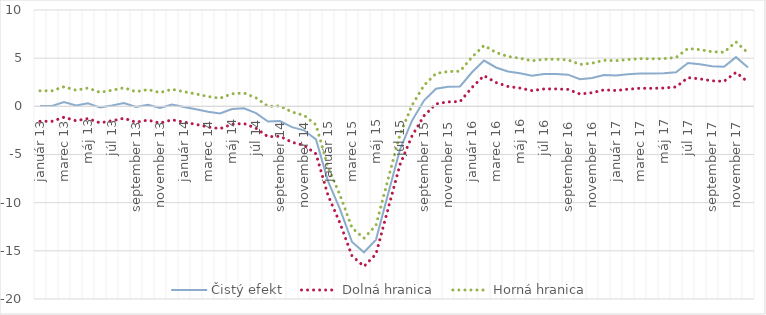
| Category | Čistý efekt | Dolná hranica | Horná hranica |
|---|---|---|---|
| 2013-01-01 | 0.032 | -1.552 | 1.616 |
| 2013-02-01 | 0.032 | -1.552 | 1.616 |
| 2013-03-01 | 0.451 | -1.133 | 2.035 |
| 2013-04-01 | 0.087 | -1.497 | 1.671 |
| 2013-05-01 | 0.317 | -1.267 | 1.901 |
| 2013-06-01 | -0.131 | -1.715 | 1.453 |
| 2013-07-01 | 0.084 | -1.5 | 1.668 |
| 2013-08-01 | 0.345 | -1.239 | 1.929 |
| 2013-09-01 | -0.065 | -1.649 | 1.519 |
| 2013-10-01 | 0.155 | -1.429 | 1.739 |
| 2013-11-01 | -0.161 | -1.745 | 1.423 |
| 2013-12-01 | 0.187 | -1.396 | 1.771 |
| 2014-01-01 | -0.064 | -1.644 | 1.517 |
| 2014-02-01 | -0.295 | -1.875 | 1.285 |
| 2014-03-01 | -0.56 | -2.141 | 1.021 |
| 2014-04-01 | -0.742 | -2.323 | 0.839 |
| 2014-05-01 | -0.276 | -1.858 | 1.305 |
| 2014-06-01 | -0.203 | -1.784 | 1.378 |
| 2014-07-01 | -0.701 | -2.28 | 0.878 |
| 2014-08-01 | -1.578 | -3.153 | -0.003 |
| 2014-09-01 | -1.53 | -3.105 | 0.045 |
| 2014-10-01 | -2.161 | -3.73 | -0.592 |
| 2014-11-01 | -2.488 | -4.046 | -0.931 |
| 2014-12-01 | -3.429 | -4.935 | -1.923 |
| 2015-01-01 | -7.762 | -9.231 | -6.293 |
| 2015-02-01 | -10.669 | -12.131 | -9.207 |
| 2015-03-01 | -14.072 | -15.527 | -12.617 |
| 2015-04-01 | -15.15 | -16.613 | -13.688 |
| 2015-05-01 | -13.837 | -15.33 | -12.344 |
| 2015-06-01 | -9.123 | -10.666 | -7.581 |
| 2015-07-01 | -4.477 | -6.049 | -2.906 |
| 2015-08-01 | -1.489 | -3.072 | 0.094 |
| 2015-09-01 | 0.6 | -0.982 | 2.182 |
| 2015-10-01 | 1.83 | 0.252 | 3.408 |
| 2015-11-01 | 2.04 | 0.466 | 3.614 |
| 2015-12-01 | 2.065 | 0.49 | 3.64 |
| 2016-01-01 | 3.534 | 1.959 | 5.109 |
| 2016-02-01 | 4.75 | 3.186 | 6.314 |
| 2016-03-01 | 4.032 | 2.473 | 5.592 |
| 2016-04-01 | 3.618 | 2.064 | 5.172 |
| 2016-05-01 | 3.443 | 1.895 | 4.991 |
| 2016-06-01 | 3.178 | 1.631 | 4.725 |
| 2016-07-01 | 3.343 | 1.803 | 4.884 |
| 2016-08-01 | 3.346 | 1.806 | 4.886 |
| 2016-09-01 | 3.289 | 1.755 | 4.824 |
| 2016-10-01 | 2.811 | 1.276 | 4.346 |
| 2016-11-01 | 2.944 | 1.411 | 4.478 |
| 2016-12-01 | 3.248 | 1.71 | 4.786 |
| 2017-01-01 | 3.191 | 1.643 | 4.739 |
| 2017-02-01 | 3.32 | 1.777 | 4.863 |
| 2017-03-01 | 3.411 | 1.875 | 4.946 |
| 2017-04-01 | 3.399 | 1.868 | 4.931 |
| 2017-05-01 | 3.43 | 1.903 | 4.958 |
| 2017-06-01 | 3.539 | 2.012 | 5.065 |
| 2017-07-01 | 4.49 | 2.976 | 6.005 |
| 2017-08-01 | 4.366 | 2.851 | 5.881 |
| 2017-09-01 | 4.159 | 2.646 | 5.671 |
| 2017-10-01 | 4.104 | 2.594 | 5.613 |
| 2017-11-01 | 5.105 | 3.524 | 6.686 |
| 2017-12-01 | 4.032 | 2.516 | 5.547 |